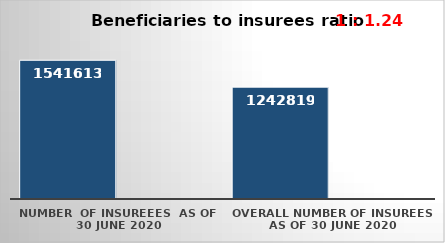
| Category | Series 0 | Series 1 |
|---|---|---|
| NUMBER  of insureees  as of  30 June 2020 | 1541613 |  |
| OVERALL number of insurees as of 30 June 2020 | 1242819 |  |